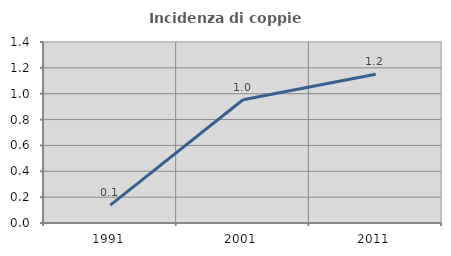
| Category | Incidenza di coppie miste |
|---|---|
| 1991.0 | 0.138 |
| 2001.0 | 0.954 |
| 2011.0 | 1.151 |